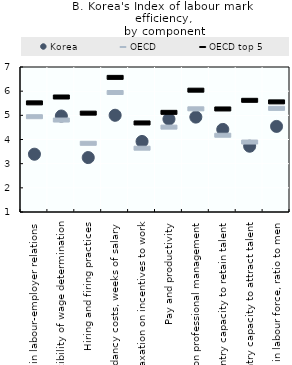
| Category | Korea | OECD | OECD top 5 |
|---|---|---|---|
| Cooperation in labour-employer relations | 3.39 | 4.944 | 5.516 |
| Flexibility of wage determination | 4.97 | 4.805 | 5.759 |
| Hiring and firing practices | 3.252 | 3.843 | 5.09 |
| Redundancy costs, weeks of salary | 5.002 | 5.944 | 6.57 |
| Effect of taxation on incentives to work | 3.919 | 3.64 | 4.685 |
| Pay and productivity | 4.844 | 4.512 | 5.124 |
| Reliance on professional management | 4.926 | 5.27 | 6.041 |
| Country capacity to retain talent | 4.416 | 4.176 | 5.264 |
| Country capacity to attract talent | 3.722 | 3.895 | 5.621 |
| Women in labour force, ratio to men | 4.541 | 5.288 | 5.557 |